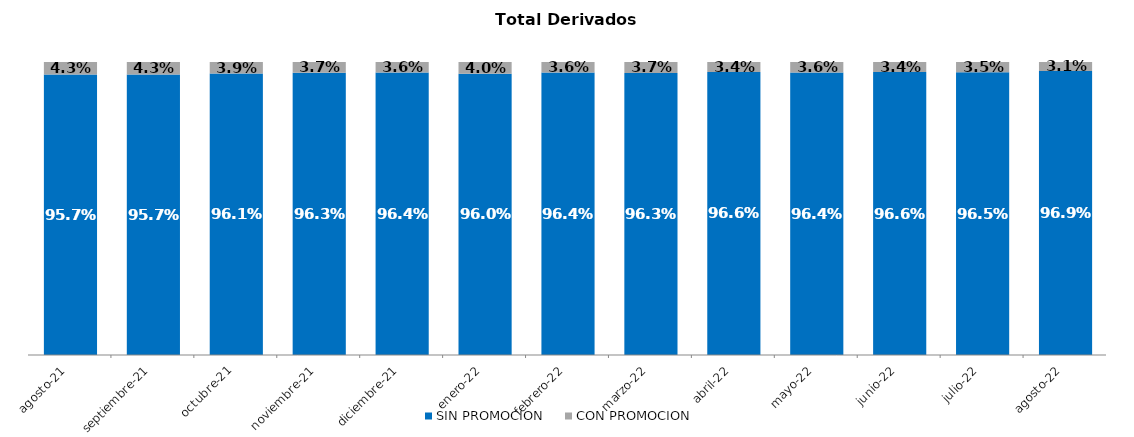
| Category | SIN PROMOCION   | CON PROMOCION   |
|---|---|---|
| 2021-08-01 | 0.957 | 0.043 |
| 2021-09-01 | 0.957 | 0.043 |
| 2021-10-01 | 0.961 | 0.039 |
| 2021-11-01 | 0.963 | 0.037 |
| 2021-12-01 | 0.964 | 0.036 |
| 2022-01-01 | 0.96 | 0.04 |
| 2022-02-01 | 0.964 | 0.036 |
| 2022-03-01 | 0.963 | 0.037 |
| 2022-04-01 | 0.966 | 0.034 |
| 2022-05-01 | 0.964 | 0.036 |
| 2022-06-01 | 0.966 | 0.034 |
| 2022-07-01 | 0.965 | 0.035 |
| 2022-08-01 | 0.969 | 0.031 |